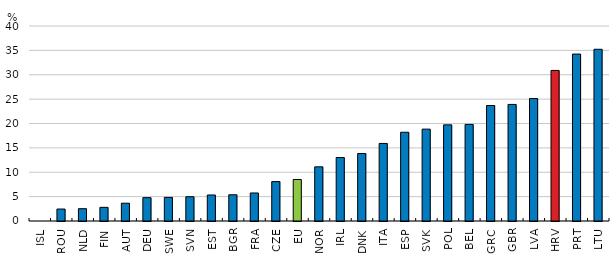
| Category | Untreated waste, % of generated waste, 2020 or latest available year |
|---|---|
| ISL | 0 |
| ROU | 2.453 |
| NLD | 2.523 |
| FIN | 2.801 |
| AUT | 3.649 |
| DEU | 4.789 |
| SWE | 4.842 |
| SVN | 4.978 |
| EST | 5.336 |
| BGR | 5.38 |
| FRA | 5.748 |
| CZE | 8.088 |
| EU | 8.515 |
| NOR | 11.111 |
| IRL | 13.023 |
| DNK | 13.843 |
| ITA | 15.908 |
| ESP | 18.206 |
| SVK | 18.846 |
| POL | 19.724 |
| BEL | 19.817 |
| GRC | 23.689 |
| GBR | 23.912 |
| LVA | 25.117 |
| HRV | 30.883 |
| PRT | 34.243 |
| LTU | 35.225 |